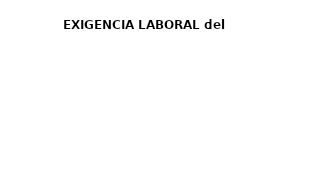
| Category | Series 0 |
|---|---|
| 0.0 | 0 |